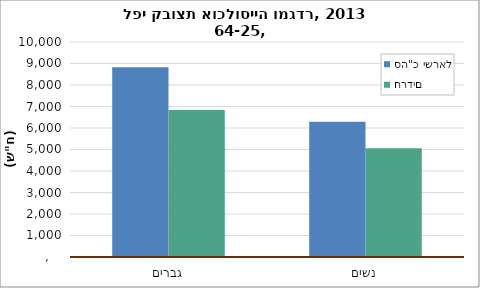
| Category | סה"כ ישראל | חרדים |
|---|---|---|
| גברים | 8821 | 6837 |
| נשים | 6292 | 5061 |